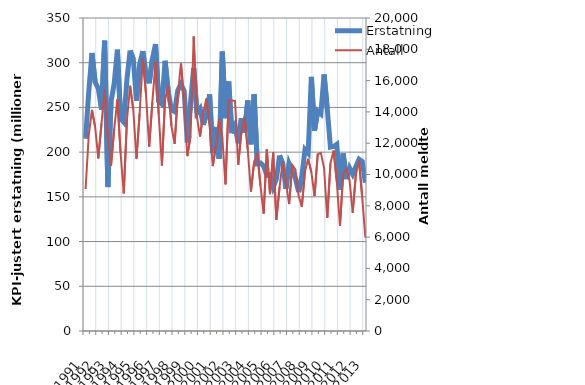
| Category | Erstatning |
|---|---|
| 1991.0 | 215.004 |
| nan | 267.504 |
| nan | 310.899 |
| nan | 278.454 |
| 1992.0 | 271.059 |
| nan | 247.673 |
| nan | 324.574 |
| nan | 160.976 |
| 1993.0 | 256.801 |
| nan | 276.693 |
| nan | 314.577 |
| nan | 237.531 |
| 1994.0 | 233.488 |
| nan | 281.142 |
| nan | 313.591 |
| nan | 304.235 |
| 1995.0 | 257.595 |
| nan | 297.989 |
| nan | 312.93 |
| nan | 286.552 |
| 1996.0 | 277.028 |
| nan | 304.113 |
| nan | 320.864 |
| nan | 256.523 |
| 1997.0 | 253.617 |
| nan | 302.072 |
| nan | 267.373 |
| nan | 247.176 |
| 1998.0 | 245.333 |
| nan | 269.126 |
| nan | 275.966 |
| nan | 268.541 |
| 1999.0 | 210.966 |
| nan | 255.986 |
| nan | 294.196 |
| nan | 244.01 |
| 2000.0 | 248.73 |
| nan | 230.669 |
| nan | 241.961 |
| nan | 264.522 |
| 2001.0 | 198.918 |
| nan | 228.152 |
| nan | 192.663 |
| nan | 312.483 |
| 2002.0 | 237.915 |
| nan | 278.926 |
| nan | 221.198 |
| nan | 229.654 |
| 2003.0 | 209.827 |
| nan | 237.76 |
| nan | 221.701 |
| nan | 257.782 |
| 2004.0 | 208.77 |
| nan | 264.654 |
| nan | 186.983 |
| nan | 187.764 |
| 2005.0 | 184.561 |
| nan | 173.945 |
| nan | 174.667 |
| nan | 160.852 |
| 2006.0 | 169.716 |
| nan | 196.264 |
| nan | 187.186 |
| nan | 159.115 |
| 2007.0 | 187.203 |
| nan | 178.828 |
| nan | 170.552 |
| nan | 155.33 |
| 2008.0 | 172.577 |
| nan | 202.916 |
| nan | 198.861 |
| nan | 284.085 |
| 2009.0 | 224.116 |
| nan | 245.97 |
| nan | 242.891 |
| nan | 286.88 |
| 2010.0 | 248.2 |
| nan | 205.51 |
| nan | 206.354 |
| nan | 208.814 |
| 2011.0 | 157.942 |
| nan | 198.404 |
| nan | 169.886 |
| nan | 182.352 |
| 2012.0 | 175.337 |
| nan | 183.788 |
| nan | 192.075 |
| nan | 189.552 |
| 2013.0 | 165.829 |